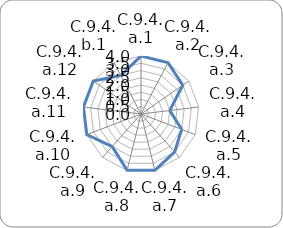
| Category | Series 0 |
|---|---|
| C.9.4.a.1 | 4 |
| C.9.4.a.2 | 4 |
| C.9.4.a.3 | 3.5 |
| C.9.4.a.4 | 2 |
| C.9.4.a.5 | 3 |
| C.9.4.a.6 | 3.5 |
| C.9.4.a.7 | 4 |
| C.9.4.a.8 | 4 |
| C.9.4.a.9 | 3 |
| C.9.4.a.10 | 4 |
| C.9.4.a.11 | 4 |
| C.9.4.a.12 | 4 |
| C.9.4.b.1 | 3 |